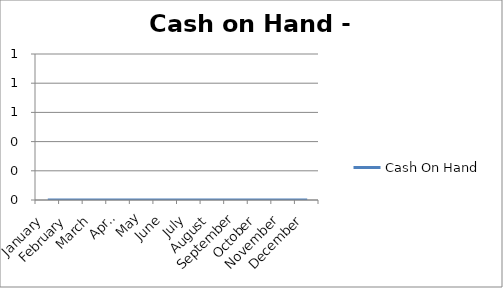
| Category | Cash On Hand |
|---|---|
| January | 0 |
| February | 0 |
| March | 0 |
| April | 0 |
| May | 0 |
| June | 0 |
| July | 0 |
| August | 0 |
| September | 0 |
| October | 0 |
| November | 0 |
| December | 0 |